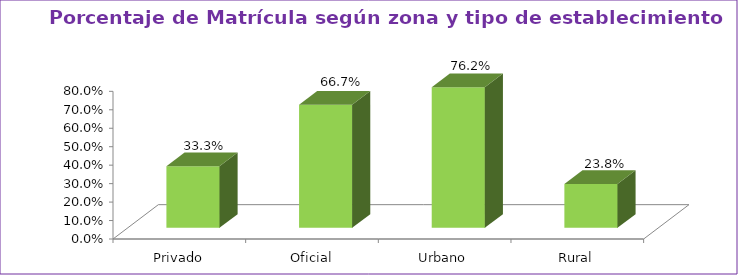
| Category | Series 1 |
|---|---|
| Privado | 0.333 |
| Oficial | 0.667 |
| Urbano | 0.762 |
| Rural | 0.238 |